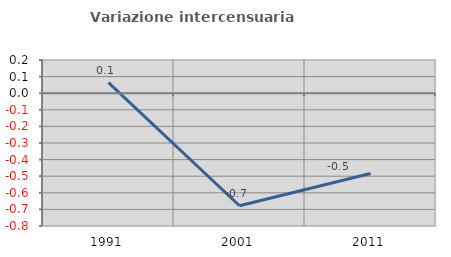
| Category | Variazione intercensuaria annua |
|---|---|
| 1991.0 | 0.064 |
| 2001.0 | -0.678 |
| 2011.0 | -0.484 |